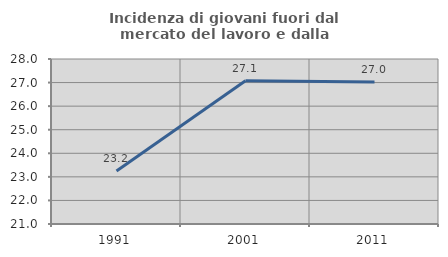
| Category | Incidenza di giovani fuori dal mercato del lavoro e dalla formazione  |
|---|---|
| 1991.0 | 23.247 |
| 2001.0 | 27.074 |
| 2011.0 | 27.027 |